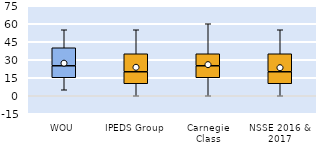
| Category | 25th | 50th | 75th |
|---|---|---|---|
| WOU | 15 | 10 | 15 |
| IPEDS Group | 10 | 10 | 15 |
| Carnegie Class | 15 | 10 | 10 |
| NSSE 2016 & 2017 | 10 | 10 | 15 |